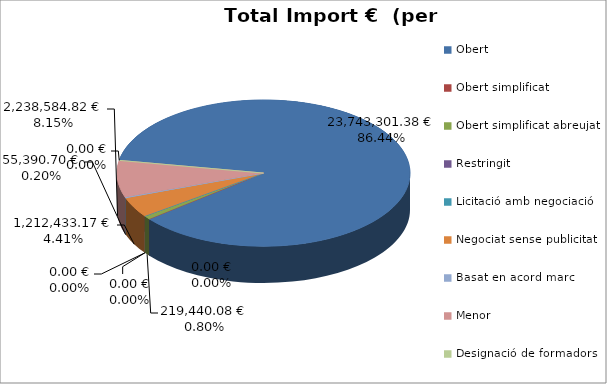
| Category | Total preu              (amb iva) |
|---|---|
| Obert | 23743301.38 |
| Obert simplificat | 0 |
| Obert simplificat abreujat | 219440.08 |
| Restringit | 0 |
| Licitació amb negociació | 0 |
| Negociat sense publicitat | 1212433.17 |
| Basat en acord marc | 55390.7 |
| Menor | 2238584.824 |
| Designació de formadors | 0 |